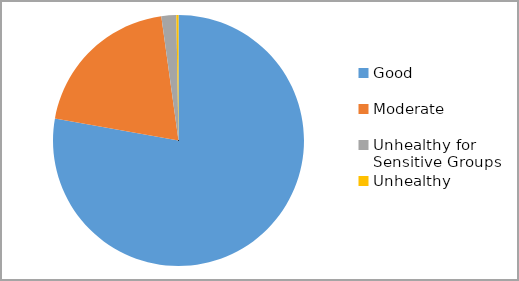
| Category | Series 0 |
|---|---|
| Good | 0.778 |
| Moderate | 0.2 |
| Unhealthy for Sensitive Groups | 0.019 |
| Unhealthy | 0.003 |